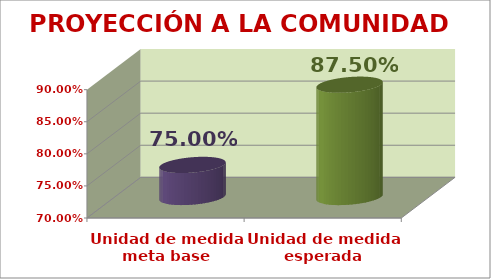
| Category | PROYECCIÓN A LA COMUNIDAD |
|---|---|
| Unidad de medida meta base | 0.75 |
| Unidad de medida esperada | 0.875 |